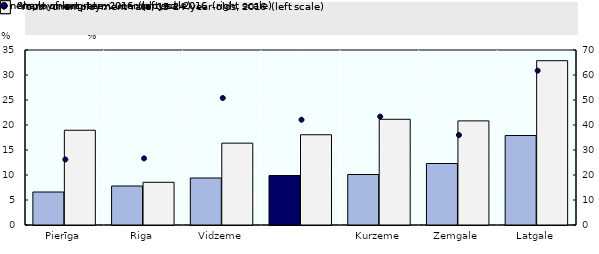
| Category | Unemployment rate, 2016 (left scale) | Youth unemployment rate, 15-24 year-olds, 2016 (left scale) |
|---|---|---|
| Pierīga | 6.6 | 18.953 |
| Riga | 7.8 | 8.543 |
| Vidzeme | 9.4 | 16.373 |
|  | 9.9 | 18.05 |
| Kurzeme | 10.1 | 21.146 |
| Zemgale | 12.3 | 20.825 |
| Latgale | 17.9 | 32.86 |